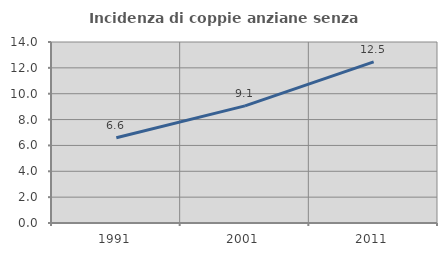
| Category | Incidenza di coppie anziane senza figli  |
|---|---|
| 1991.0 | 6.597 |
| 2001.0 | 9.061 |
| 2011.0 | 12.46 |